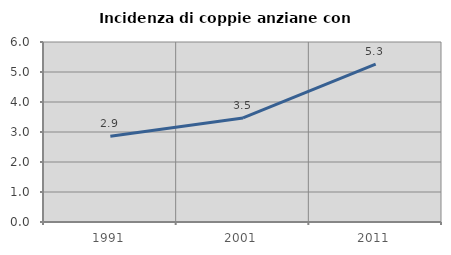
| Category | Incidenza di coppie anziane con figli |
|---|---|
| 1991.0 | 2.859 |
| 2001.0 | 3.47 |
| 2011.0 | 5.266 |